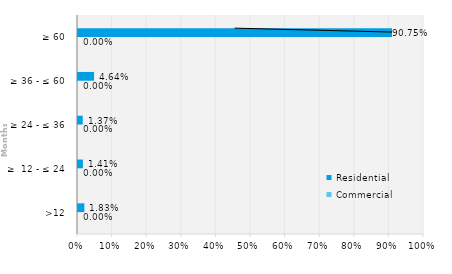
| Category | Commercial | Residential |
|---|---|---|
| >12 | 0 | 0.018 |
| ≥  12 - ≤ 24 | 0 | 0.014 |
| ≥ 24 - ≤ 36 | 0 | 0.014 |
| ≥ 36 - ≤ 60 | 0 | 0.046 |
| ≥ 60 | 0 | 0.907 |